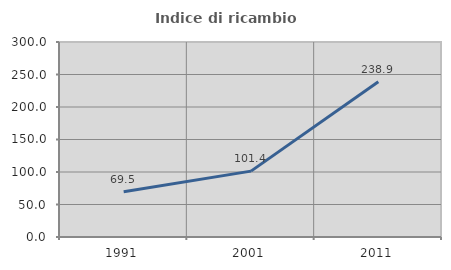
| Category | Indice di ricambio occupazionale  |
|---|---|
| 1991.0 | 69.474 |
| 2001.0 | 101.37 |
| 2011.0 | 238.889 |